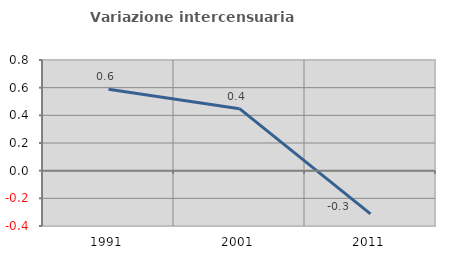
| Category | Variazione intercensuaria annua |
|---|---|
| 1991.0 | 0.588 |
| 2001.0 | 0.448 |
| 2011.0 | -0.313 |